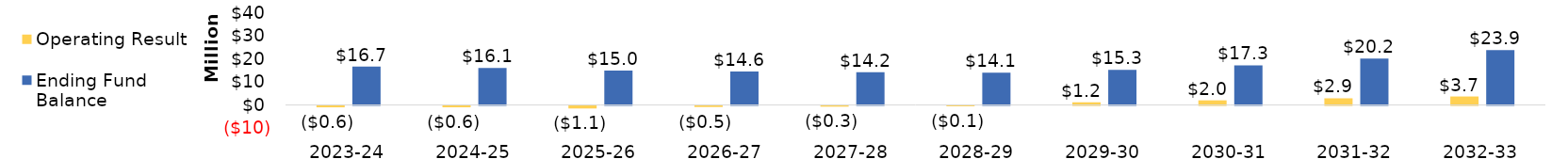
| Category | Operating Result | Ending Fund Balance |
|---|---|---|
| 2023-24 | -606612.692 | 16727208.308 |
| 2024-25 | -596263.057 | 16130945.251 |
| 2025-26 | -1110134.464 | 15020810.787 |
| 2026-27 | -468974.796 | 14551835.991 |
| 2027-28 | -313718.012 | 14238117.98 |
| 2028-29 | -142397.305 | 14095720.675 |
| 2029-30 | 1180873.178 | 15276593.853 |
| 2030-31 | 2025192.524 | 17301786.377 |
| 2031-32 | 2915673.32 | 20217459.697 |
| 2032-33 | 3712144.246 | 23929603.943 |